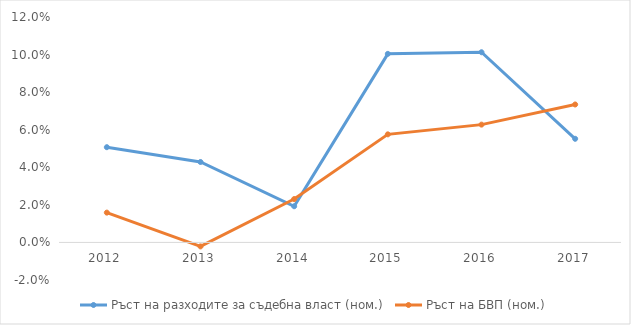
| Category | Ръст на разходите за съдебна власт (ном.) | Ръст на БВП (ном.) |
|---|---|---|
| 2012.0 | 0.051 | 0.016 |
| 2013.0 | 0.043 | -0.002 |
| 2014.0 | 0.019 | 0.023 |
| 2015.0 | 0.1 | 0.058 |
| 2016.0 | 0.101 | 0.063 |
| 2017.0 | 0.055 | 0.073 |